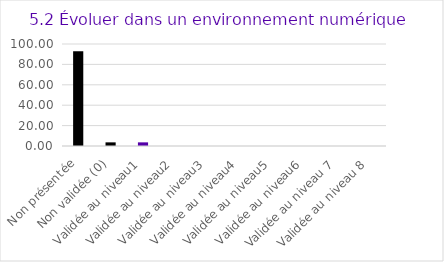
| Category | Series 0 |
|---|---|
| Non présentée | 92.857 |
| Non validée (0) | 3.571 |
| Validée au niveau1 | 3.571 |
| Validée au niveau2 | 0 |
| Validée au niveau3 | 0 |
| Validée au niveau4 | 0 |
| Validée au niveau5 | 0 |
| Validée au niveau6 | 0 |
| Validée au niveau 7 | 0 |
| Validée au niveau 8 | 0 |